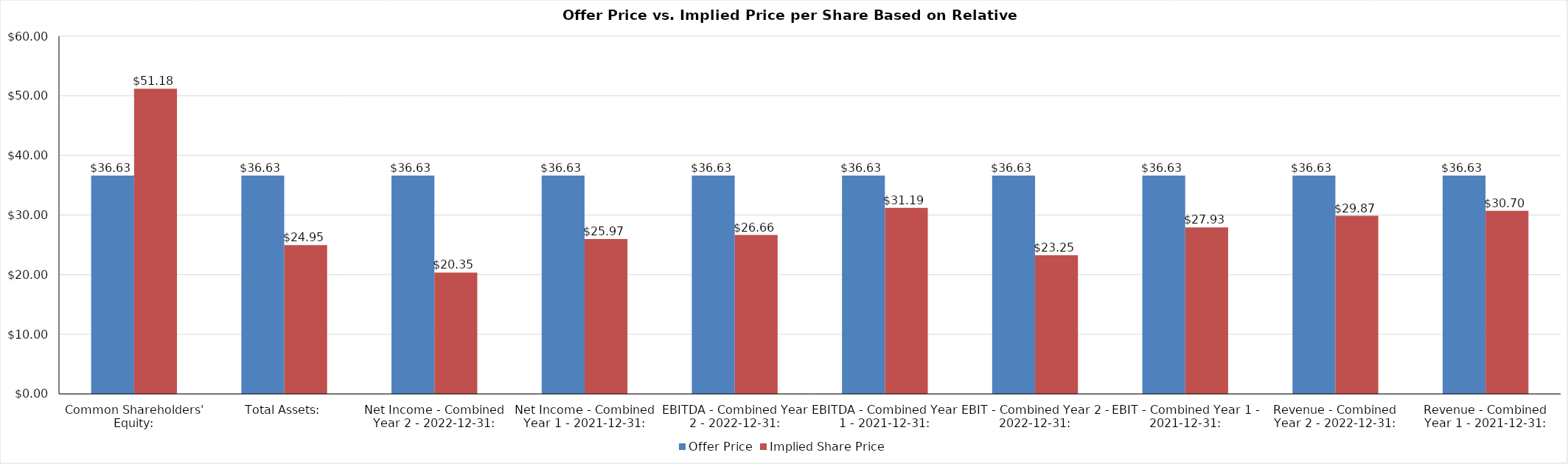
| Category | Offer Price | Implied Share Price |
|---|---|---|
| Common Shareholders' Equity: | 36.632 | 51.183 |
| Total Assets: | 36.632 | 24.95 |
| Net Income - Combined Year 2 - 2022-12-31: | 36.632 | 20.352 |
| Net Income - Combined Year 1 - 2021-12-31: | 36.632 | 25.967 |
| EBITDA - Combined Year 2 - 2022-12-31: | 36.632 | 26.657 |
| EBITDA - Combined Year 1 - 2021-12-31: | 36.632 | 31.195 |
| EBIT - Combined Year 2 - 2022-12-31: | 36.632 | 23.254 |
| EBIT - Combined Year 1 - 2021-12-31: | 36.632 | 27.93 |
| Revenue - Combined Year 2 - 2022-12-31: | 36.632 | 29.869 |
| Revenue - Combined Year 1 - 2021-12-31: | 36.632 | 30.698 |